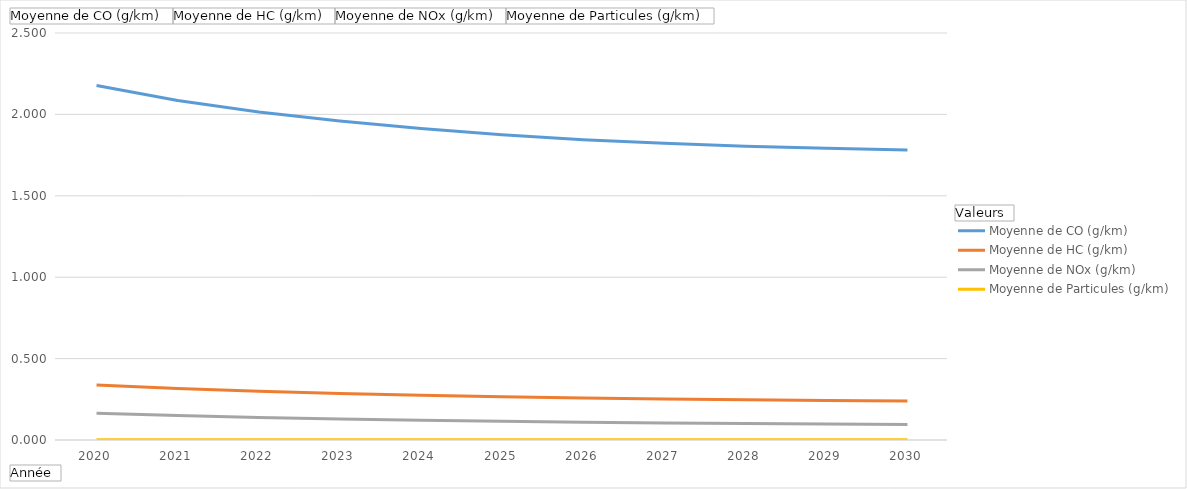
| Category | Moyenne de CO (g/km) | Moyenne de HC (g/km) | Moyenne de NOx (g/km) | Moyenne de Particules (g/km) |
|---|---|---|---|---|
| 2020 | 2.177 | 0.338 | 0.165 | 0.001 |
| 2021 | 2.086 | 0.317 | 0.15 | 0.001 |
| 2022 | 2.015 | 0.3 | 0.139 | 0.001 |
| 2023 | 1.959 | 0.286 | 0.129 | 0.001 |
| 2024 | 1.914 | 0.275 | 0.121 | 0.001 |
| 2025 | 1.876 | 0.266 | 0.115 | 0.001 |
| 2026 | 1.845 | 0.258 | 0.11 | 0.001 |
| 2027 | 1.823 | 0.252 | 0.105 | 0.001 |
| 2028 | 1.805 | 0.247 | 0.101 | 0.001 |
| 2029 | 1.792 | 0.243 | 0.098 | 0.001 |
| 2030 | 1.782 | 0.24 | 0.095 | 0.001 |